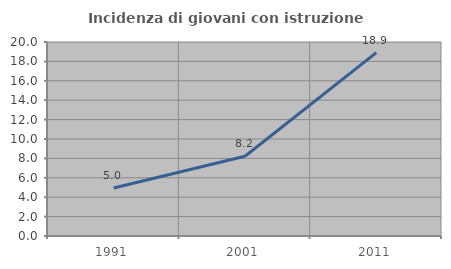
| Category | Incidenza di giovani con istruzione universitaria |
|---|---|
| 1991.0 | 4.95 |
| 2001.0 | 8.219 |
| 2011.0 | 18.898 |